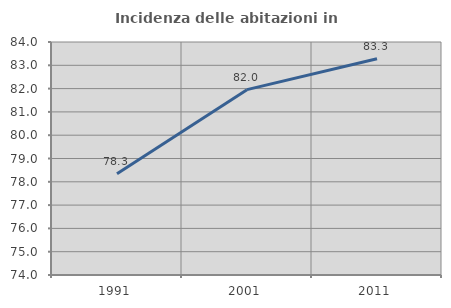
| Category | Incidenza delle abitazioni in proprietà  |
|---|---|
| 1991.0 | 78.341 |
| 2001.0 | 81.956 |
| 2011.0 | 83.278 |